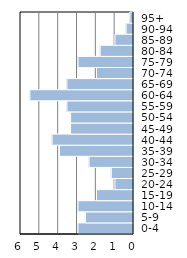
| Category | Series 0 |
|---|---|
| 0-4 | 2.947 |
| 5-9 | 2.554 |
| 10-14 | 2.947 |
| 15-19 | 1.965 |
| 20-24 | 0.982 |
| 25-29 | 1.179 |
| 30-34 | 2.358 |
| 35-39 | 3.929 |
| 40-44 | 4.322 |
| 45-49 | 3.34 |
| 50-54 | 3.34 |
| 55-59 | 3.536 |
| 60-64 | 5.501 |
| 65-69 | 3.536 |
| 70-74 | 1.965 |
| 75-79 | 2.947 |
| 80-84 | 1.768 |
| 85-89 | 0.982 |
| 90-94 | 0.393 |
| 95+ | 0.196 |